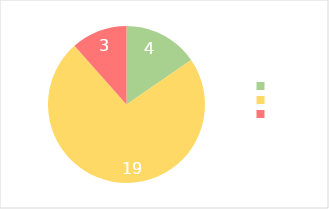
| Category | Total |
|---|---|
| Done | 4 |
| Ongoing | 19 |
| Pending | 3 |